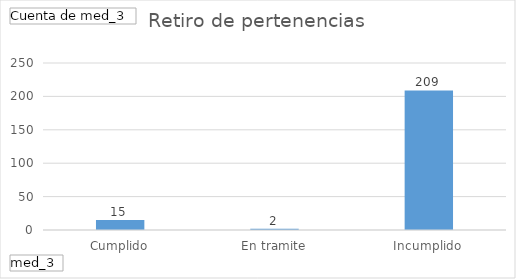
| Category | Total |
|---|---|
| Cumplido | 15 |
| En tramite | 2 |
| Incumplido | 209 |